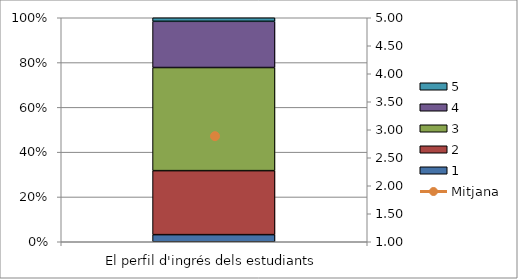
| Category | 1 | 2 | 3 | 4 | 5 |
|---|---|---|---|---|---|
| El perfil d'ingrés dels estudiants | 2 | 18 | 29 | 13 | 1 |